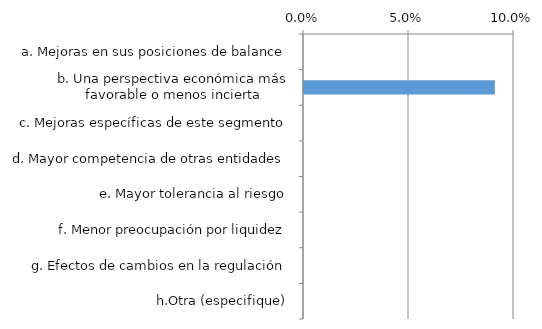
| Category | Series 0 |
|---|---|
| a. Mejoras en sus posiciones de balance | 0 |
| b. Una perspectiva económica más favorable o menos incierta | 0.091 |
| c. Mejoras específicas de este segmento | 0 |
| d. Mayor competencia de otras entidades | 0 |
| e. Mayor tolerancia al riesgo | 0 |
| f. Menor preocupación por liquidez | 0 |
| g. Efectos de cambios en la regulación | 0 |
| h.Otra (especifique) | 0 |